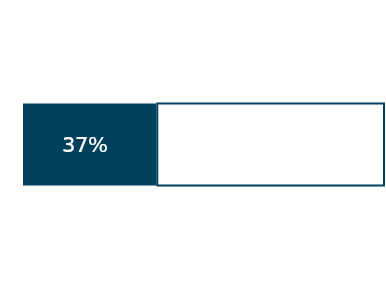
| Category | Series 0 | Not Complete |
|---|---|---|
| 0 | 0.369 | 0.631 |